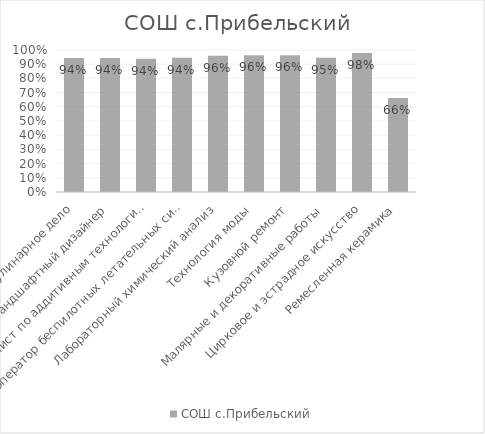
| Category | СОШ с.Прибельский |
|---|---|
| Кулинарное дело | 0.943 |
| Ландшафтный дизайнер | 0.943 |
| Специалист по аддитивным технологиям | 0.939 |
| Оператор беспилотных летательных систем | 0.945 |
| Лабораторный химический анализ | 0.959 |
| Технология моды | 0.964 |
| Кузовной ремонт | 0.964 |
| Малярные и декоративные работы | 0.946 |
| Цирковое и эстрадное искусство | 0.98 |
| Ремесленная керамика | 0.662 |